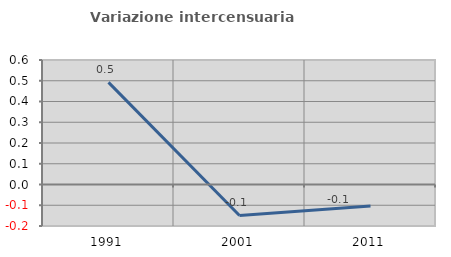
| Category | Variazione intercensuaria annua |
|---|---|
| 1991.0 | 0.492 |
| 2001.0 | -0.149 |
| 2011.0 | -0.104 |